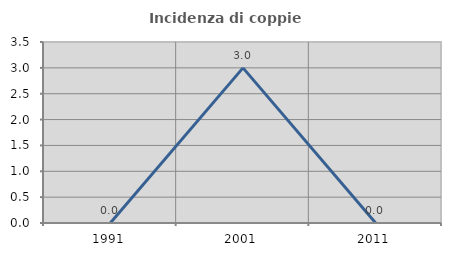
| Category | Incidenza di coppie miste |
|---|---|
| 1991.0 | 0 |
| 2001.0 | 3 |
| 2011.0 | 0 |